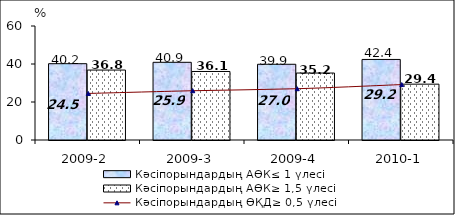
| Category | Кәсіпорындардың АӨК≤ 1 үлесі | Кәсіпорындардың АӨК≥ 1,5 үлесі |
|---|---|---|
| 2009-2 | 40.159 | 36.816 |
| 2009-3 | 40.892 | 36.064 |
| 2009-4 | 39.855 | 35.243 |
| 2010-1 | 42.395 | 29.39 |